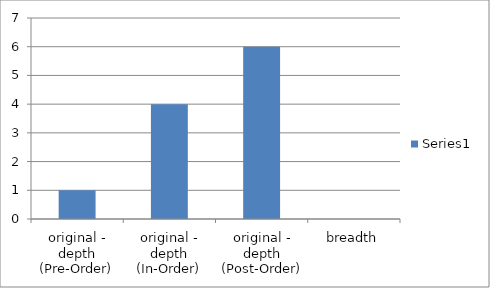
| Category | Series 0 |
|---|---|
| original - depth (Pre-Order) | 1 |
| original - depth (In-Order) | 4 |
| original - depth (Post-Order) | 6 |
| breadth | 0 |